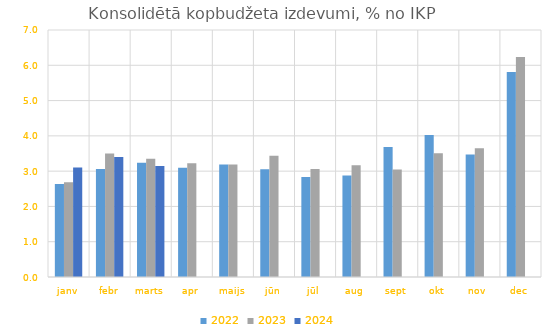
| Category | 2022 | 2023 | 2024 |
|---|---|---|---|
| janv | 2.636 | 2.688 | 3.103 |
| febr | 3.06 | 3.497 | 3.399 |
| marts | 3.236 | 3.354 | 3.149 |
| apr | 3.093 | 3.224 | 0 |
| maijs | 3.189 | 3.186 | 0 |
| jūn | 3.053 | 3.438 | 0 |
| jūl | 2.836 | 3.058 | 0 |
| aug | 2.878 | 3.166 | 0 |
| sept | 3.682 | 3.044 | 0 |
| okt | 4.021 | 3.511 | 0 |
| nov | 3.468 | 3.646 | 0 |
| dec | 5.812 | 6.236 | 0 |